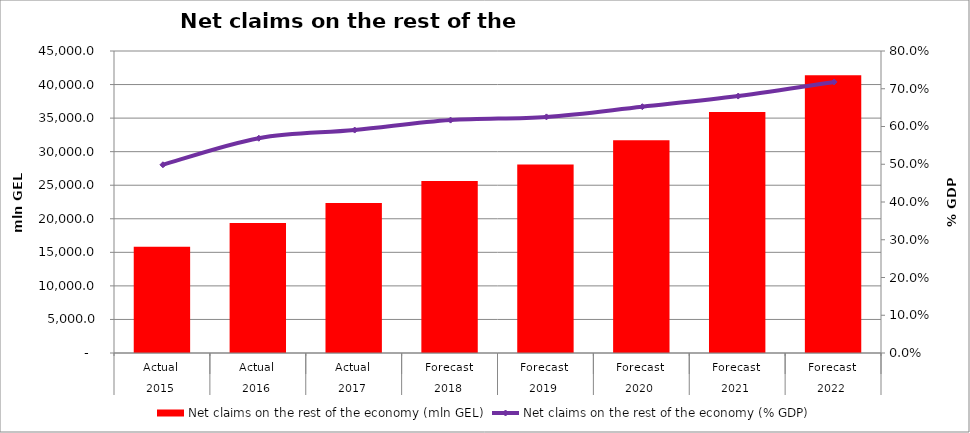
| Category | Net claims on the rest of the economy (mln GEL) |
|---|---|
| 0 | 15832.596 |
| 1 | 19360.489 |
| 2 | 22352.321 |
| 3 | 25619.48 |
| 4 | 28090.39 |
| 5 | 31691.67 |
| 6 | 35925.78 |
| 7 | 41378.59 |